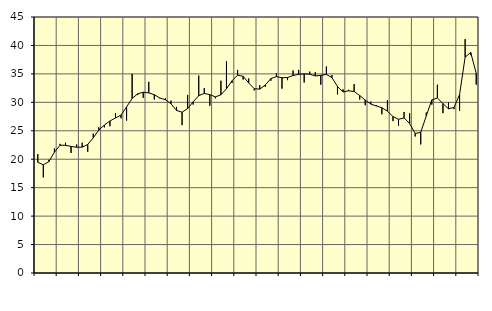
| Category | Piggar | Series 1 |
|---|---|---|
| nan | 20.9 | 19.46 |
| 1.0 | 16.8 | 19.02 |
| 1.0 | 19.9 | 19.57 |
| 1.0 | 21.9 | 21.24 |
| nan | 22.7 | 22.45 |
| 2.0 | 22.9 | 22.45 |
| 2.0 | 21.1 | 22.24 |
| 2.0 | 22.6 | 22.11 |
| nan | 22.9 | 22.12 |
| 3.0 | 21.3 | 22.6 |
| 3.0 | 24.5 | 23.76 |
| 3.0 | 25.6 | 25.14 |
| nan | 25.6 | 26.01 |
| 4.0 | 25.8 | 26.72 |
| 4.0 | 28.1 | 27.25 |
| 4.0 | 27.2 | 27.76 |
| nan | 26.8 | 29.19 |
| 5.0 | 35 | 30.68 |
| 5.0 | 31.3 | 31.5 |
| 5.0 | 30.8 | 31.78 |
| nan | 33.6 | 31.66 |
| 6.0 | 30.5 | 31.34 |
| 6.0 | 30.7 | 30.76 |
| 6.0 | 30.7 | 30.45 |
| nan | 30.3 | 29.75 |
| 7.0 | 29.2 | 28.57 |
| 7.0 | 26 | 28.27 |
| 7.0 | 31.3 | 28.9 |
| nan | 29.6 | 30.09 |
| 8.0 | 34.7 | 31.16 |
| 8.0 | 32.5 | 31.57 |
| 8.0 | 29.4 | 31.35 |
| nan | 30.7 | 30.96 |
| 9.0 | 33.8 | 31.33 |
| 9.0 | 37.2 | 32.38 |
| 9.0 | 33.4 | 33.78 |
| nan | 35.7 | 34.78 |
| 10.0 | 34 | 34.57 |
| 10.0 | 34.2 | 33.41 |
| 10.0 | 32.1 | 32.4 |
| nan | 33 | 32.32 |
| 11.0 | 32.7 | 33.06 |
| 11.0 | 33.8 | 34.17 |
| 11.0 | 35.1 | 34.52 |
| nan | 32.4 | 34.32 |
| 12.0 | 33.9 | 34.36 |
| 12.0 | 35.6 | 34.71 |
| 12.0 | 35.7 | 34.93 |
| nan | 33.5 | 35 |
| 13.0 | 35.4 | 34.95 |
| 13.0 | 35.3 | 34.64 |
| 13.0 | 33.1 | 34.74 |
| nan | 36.3 | 34.9 |
| 14.0 | 34.8 | 34.35 |
| 14.0 | 31.4 | 32.8 |
| 14.0 | 32.3 | 31.82 |
| nan | 32.2 | 32.03 |
| 15.0 | 33.2 | 31.9 |
| 15.0 | 30.5 | 31.2 |
| 15.0 | 29.5 | 30.39 |
| nan | 30.1 | 29.7 |
| 16.0 | 29.5 | 29.36 |
| 16.0 | 27.9 | 29.05 |
| 16.0 | 30.4 | 28.44 |
| nan | 26.7 | 27.5 |
| 17.0 | 25.9 | 27.02 |
| 17.0 | 28.3 | 27.27 |
| 17.0 | 28.1 | 26.27 |
| nan | 24 | 24.52 |
| 18.0 | 22.6 | 24.72 |
| 18.0 | 28.2 | 27.61 |
| 18.0 | 29.6 | 30.43 |
| nan | 33.1 | 30.76 |
| 19.0 | 28.1 | 29.79 |
| 19.0 | 30 | 28.86 |
| 19.0 | 28.8 | 29.11 |
| nan | 28.5 | 31.37 |
| 20.0 | 41.1 | 37.93 |
| 20.0 | 38.3 | 38.78 |
| 20.0 | 33.1 | 35.11 |